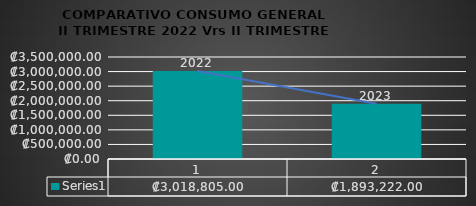
| Category | Series 0 |
|---|---|
| 0 | 3018805 |
| 1 | 1893222 |